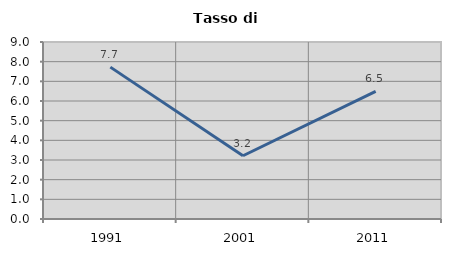
| Category | Tasso di disoccupazione   |
|---|---|
| 1991.0 | 7.723 |
| 2001.0 | 3.216 |
| 2011.0 | 6.49 |